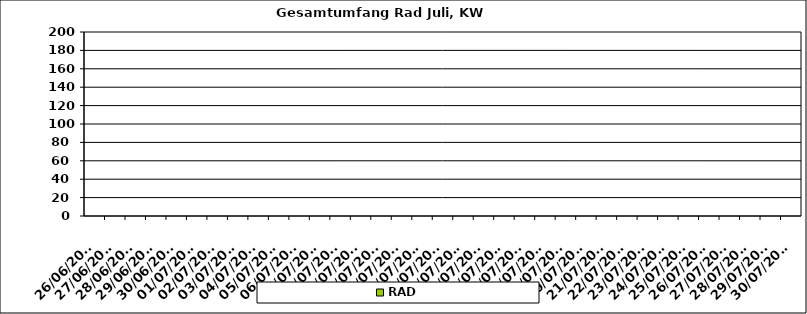
| Category | RAD |
|---|---|
| 26/06/2023 | 0 |
| 27/06/2023 | 0 |
| 28/06/2023 | 0 |
| 29/06/2023 | 0 |
| 30/06/2023 | 0 |
| 01/07/2023 | 0 |
| 02/07/2023 | 0 |
| 03/07/2023 | 0 |
| 04/07/2023 | 0 |
| 05/07/2023 | 0 |
| 06/07/2023 | 0 |
| 07/07/2023 | 0 |
| 08/07/2023 | 0 |
| 09/07/2023 | 0 |
| 10/07/2023 | 0 |
| 11/07/2023 | 0 |
| 12/07/2023 | 0 |
| 13/07/2023 | 0 |
| 14/07/2023 | 0 |
| 15/07/2023 | 0 |
| 16/07/2023 | 0 |
| 17/07/2023 | 0 |
| 18/07/2023 | 0 |
| 19/07/2023 | 0 |
| 20/07/2023 | 0 |
| 21/07/2023 | 0 |
| 22/07/2023 | 0 |
| 23/07/2023 | 0 |
| 24/07/2023 | 0 |
| 25/07/2023 | 0 |
| 26/07/2023 | 0 |
| 27/07/2023 | 0 |
| 28/07/2023 | 0 |
| 29/07/2023 | 0 |
| 30/07/2023 | 0 |